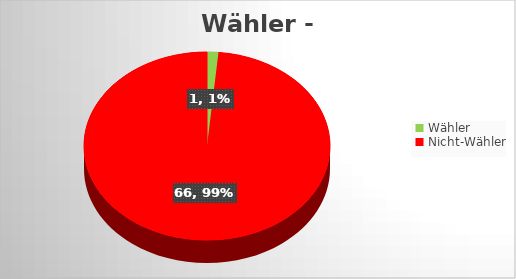
| Category | Series 0 |
|---|---|
| Wähler | 1 |
| Nicht-Wähler | 66 |